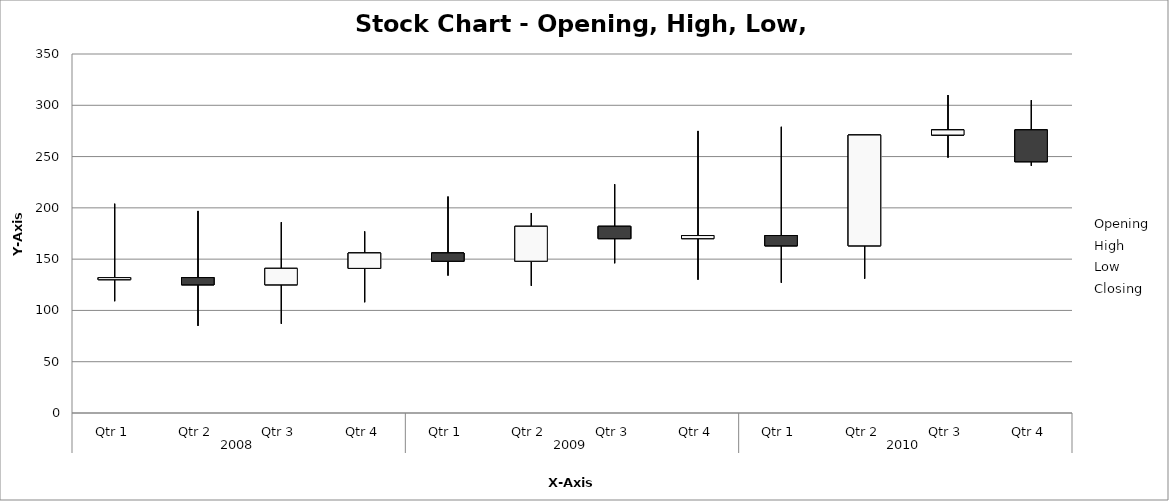
| Category | Opening | High | Low | Closing |
|---|---|---|---|---|
| 0 | 130 | 204 | 109 | 132 |
| 1 | 132 | 197 | 85 | 125 |
| 2 | 125 | 186 | 87 | 141 |
| 3 | 141 | 177 | 108 | 156 |
| 4 | 156 | 211 | 134 | 148 |
| 5 | 148 | 195 | 124 | 182 |
| 6 | 182 | 223 | 146 | 170 |
| 7 | 170 | 275 | 130 | 173 |
| 8 | 173 | 279 | 127 | 163 |
| 9 | 163 | 271 | 131 | 271 |
| 10 | 271 | 310 | 249 | 276 |
| 11 | 276 | 305 | 241 | 245 |